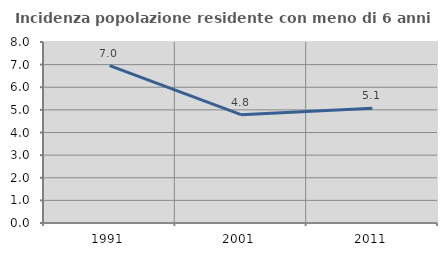
| Category | Incidenza popolazione residente con meno di 6 anni |
|---|---|
| 1991.0 | 6.955 |
| 2001.0 | 4.79 |
| 2011.0 | 5.07 |